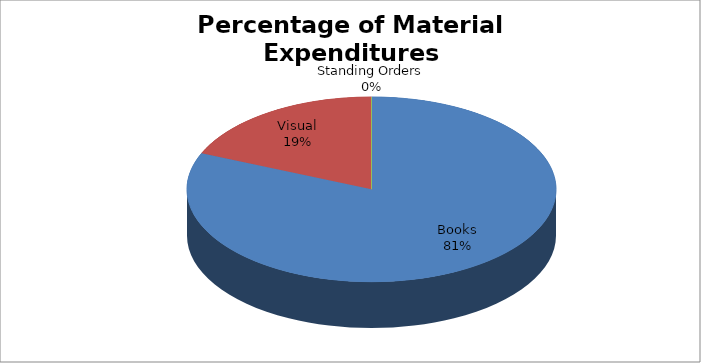
| Category | Series 0 |
|---|---|
| Books | 48836.32 |
| Visual | 11157.92 |
| Standing Orders | 0 |